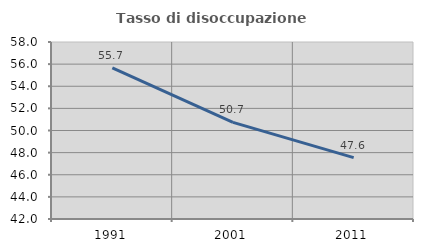
| Category | Tasso di disoccupazione giovanile  |
|---|---|
| 1991.0 | 55.656 |
| 2001.0 | 50.735 |
| 2011.0 | 47.552 |